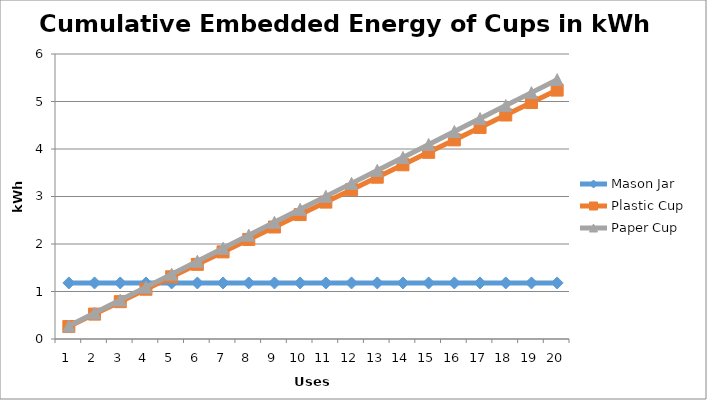
| Category | Mason Jar  | Plastic Cup  | Paper Cup |
|---|---|---|---|
| 0 | 1.18 | 0.262 | 0.273 |
| 1 | 1.18 | 0.524 | 0.546 |
| 2 | 1.18 | 0.786 | 0.819 |
| 3 | 1.18 | 1.048 | 1.092 |
| 4 | 1.18 | 1.31 | 1.365 |
| 5 | 1.18 | 1.572 | 1.638 |
| 6 | 1.18 | 1.834 | 1.911 |
| 7 | 1.18 | 2.096 | 2.184 |
| 8 | 1.18 | 2.358 | 2.457 |
| 9 | 1.18 | 2.62 | 2.73 |
| 10 | 1.18 | 2.882 | 3.003 |
| 11 | 1.18 | 3.144 | 3.276 |
| 12 | 1.18 | 3.406 | 3.549 |
| 13 | 1.18 | 3.668 | 3.822 |
| 14 | 1.18 | 3.93 | 4.095 |
| 15 | 1.18 | 4.192 | 4.368 |
| 16 | 1.18 | 4.454 | 4.641 |
| 17 | 1.18 | 4.716 | 4.914 |
| 18 | 1.18 | 4.978 | 5.187 |
| 19 | 1.18 | 5.24 | 5.46 |